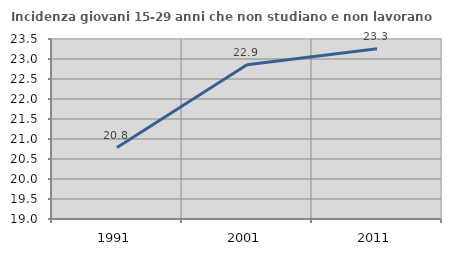
| Category | Incidenza giovani 15-29 anni che non studiano e non lavorano  |
|---|---|
| 1991.0 | 20.787 |
| 2001.0 | 22.857 |
| 2011.0 | 23.256 |